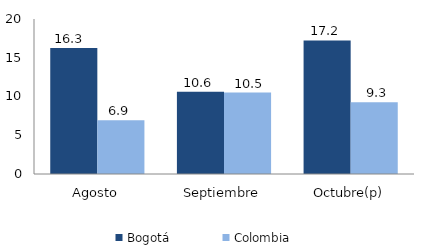
| Category | Bogotá | Colombia |
|---|---|---|
| Agosto | 16.262 | 6.941 |
| Septiembre | 10.608 | 10.511 |
| Octubre(p) | 17.235 | 9.252 |